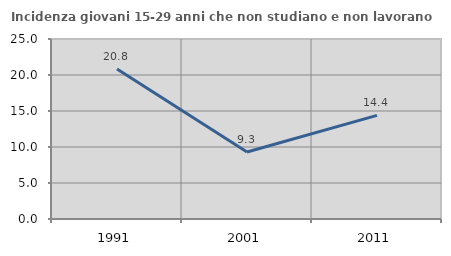
| Category | Incidenza giovani 15-29 anni che non studiano e non lavorano  |
|---|---|
| 1991.0 | 20.833 |
| 2001.0 | 9.302 |
| 2011.0 | 14.397 |